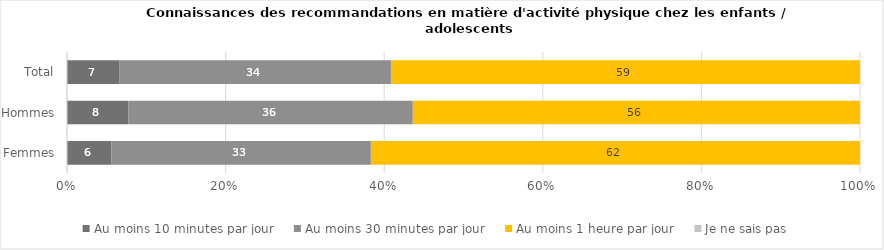
| Category | Au moins 10 minutes par jour | Au moins 30 minutes par jour | Au moins 1 heure par jour | Je ne sais pas |
|---|---|---|---|---|
| Total | 6.6 | 34 | 58.8 | 0 |
| Hommes | 7.7 | 35.6 | 56 | 0 |
| Femmes | 5.6 | 32.6 | 61.5 | 0 |